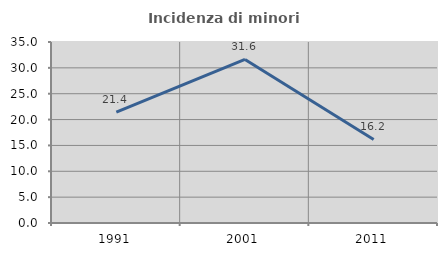
| Category | Incidenza di minori stranieri |
|---|---|
| 1991.0 | 21.429 |
| 2001.0 | 31.633 |
| 2011.0 | 16.162 |